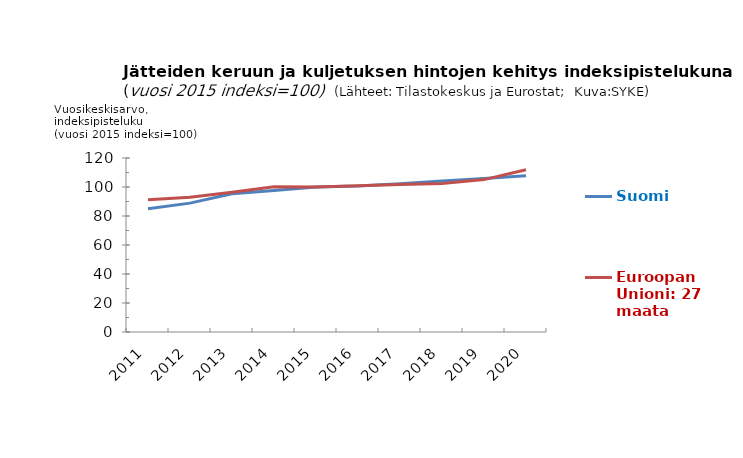
| Category | Suomi | Euroopan Unioni: 27 maata |
|---|---|---|
| 2011 | 85.07 | 91.25 |
| 2012 | 88.87 | 92.92 |
| 2013 | 95.34 | 96.34 |
| 2014 | 97.51 | 100.21 |
| 2015 | 100 | 100 |
| 2016 | 100.67 | 100.82 |
| 2017 | 102.29 | 101.67 |
| 2018 | 104.06 | 102.47 |
| 2019 | 105.78 | 105.1 |
| 2020 | 107.81 | 111.9 |